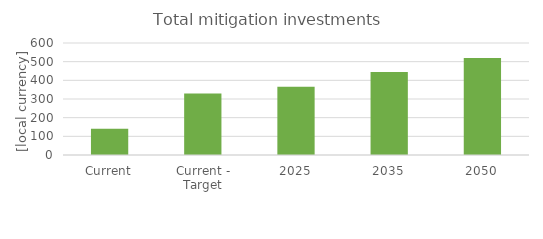
| Category | Total mitigation investments |
|---|---|
| Current | 140 |
| Current - Target | 330 |
| 2025 | 365 |
| 2035 | 445 |
| 2050 | 520 |